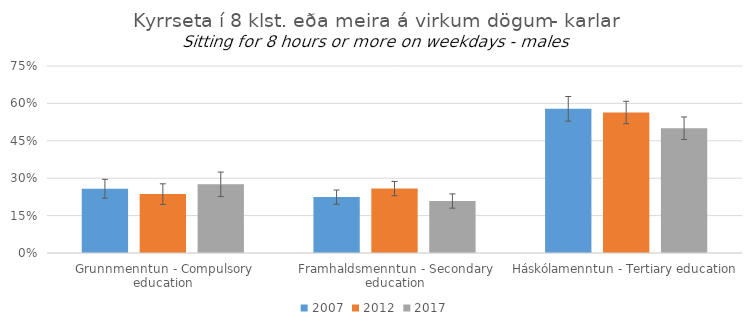
| Category | 2007 | 2012 | 2017 |
|---|---|---|---|
| Grunnmenntun - Compulsory education | 0.258 | 0.236 | 0.275 |
| Framhaldsmenntun - Secondary education | 0.224 | 0.258 | 0.208 |
| Háskólamenntun - Tertiary education | 0.578 | 0.564 | 0.501 |